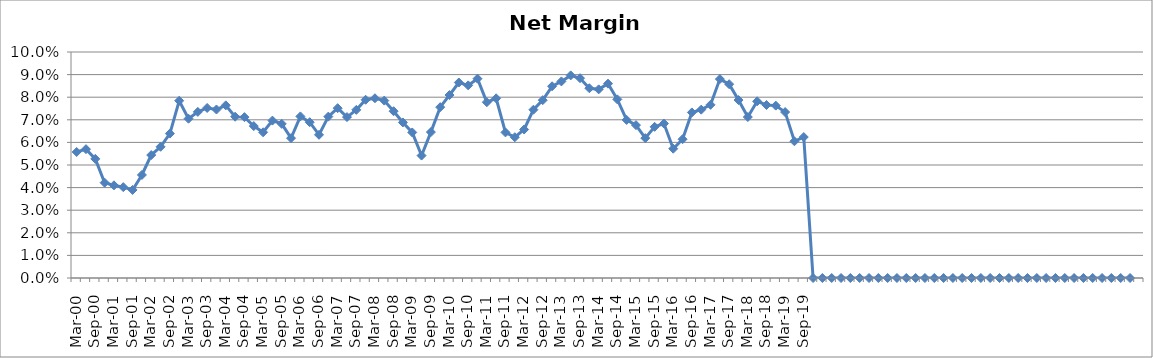
| Category | Series 0 |
|---|---|
| Mar-00 | 0.056 |
| Jun-00 | 0.057 |
| Sep-00 | 0.053 |
| Dec-00 | 0.042 |
| Mar-01 | 0.041 |
| Jun-01 | 0.04 |
| Sep-01 | 0.039 |
| Dec-01 | 0.046 |
| Mar-02 | 0.054 |
| Jun-02 | 0.058 |
| Sep-02 | 0.064 |
| Dec-02 | 0.078 |
| Mar-03 | 0.07 |
| Jun-03 | 0.074 |
| Sep-03 | 0.075 |
| Dec-03 | 0.075 |
| Mar-04 | 0.076 |
| Jun-04 | 0.071 |
| Sep-04 | 0.071 |
| Dec-04 | 0.067 |
| Mar-05 | 0.064 |
| Jun-05 | 0.07 |
| Sep-05 | 0.068 |
| Dec-05 | 0.062 |
| Mar-06 | 0.072 |
| Jun-06 | 0.069 |
| Sep-06 | 0.063 |
| Dec-06 | 0.071 |
| Mar-07 | 0.075 |
| Jun-07 | 0.071 |
| Sep-07 | 0.074 |
| Dec-07 | 0.079 |
| Mar-08 | 0.08 |
| Jun-08 | 0.078 |
| Sep-08 | 0.074 |
| Dec-08 | 0.069 |
| Mar-09 | 0.064 |
| Jun-09 | 0.054 |
| Sep-09 | 0.065 |
| Dec-09 | 0.076 |
| Mar-10 | 0.081 |
| Jun-10 | 0.087 |
| Sep-10 | 0.085 |
| Dec-10 | 0.088 |
| Mar-11 | 0.078 |
| Jun-11 | 0.08 |
| Sep-11 | 0.064 |
| Dec-11 | 0.062 |
| Mar-12 | 0.066 |
| Jun-12 | 0.074 |
| Sep-12 | 0.079 |
| Dec-12 | 0.085 |
| Mar-13 | 0.087 |
| Jun-13 | 0.09 |
| Sep-13 | 0.088 |
| Dec-13 | 0.084 |
| Mar-14 | 0.083 |
| Jun-14 | 0.086 |
| Sep-14 | 0.079 |
| Dec-14 | 0.07 |
| Mar-15 | 0.068 |
| Jun-15 | 0.062 |
| Sep-15 | 0.067 |
| Dec-15 | 0.068 |
| Mar-16 | 0.057 |
| Jun-16 | 0.061 |
| Sep-16 | 0.073 |
| Dec-16 | 0.074 |
| Mar-17 | 0.077 |
| Jun-17 | 0.088 |
| Sep-17 | 0.086 |
| Dec-17 | 0.079 |
| Mar-18 | 0.071 |
| Jun-18 | 0.078 |
| Sep-18 | 0.077 |
| Dec-18 | 0.076 |
| Mar-19 | 0.073 |
| Jun-19 | 0.06 |
| Sep-19 | 0.062 |